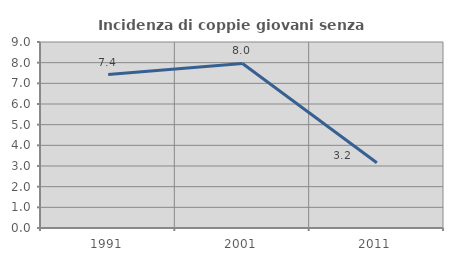
| Category | Incidenza di coppie giovani senza figli |
|---|---|
| 1991.0 | 7.424 |
| 2001.0 | 7.962 |
| 2011.0 | 3.158 |